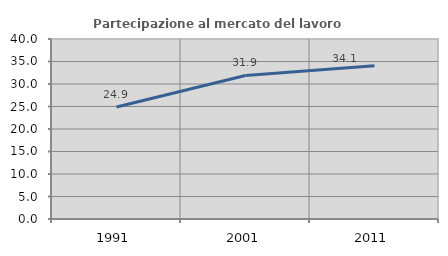
| Category | Partecipazione al mercato del lavoro  femminile |
|---|---|
| 1991.0 | 24.9 |
| 2001.0 | 31.897 |
| 2011.0 | 34.081 |